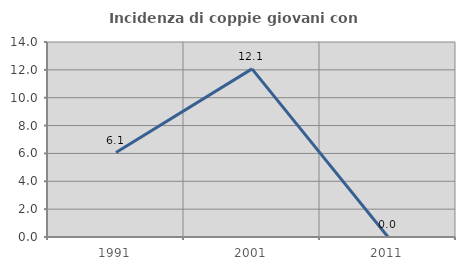
| Category | Incidenza di coppie giovani con figli |
|---|---|
| 1991.0 | 6.061 |
| 2001.0 | 12.069 |
| 2011.0 | 0 |